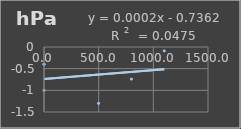
| Category | Presión Admosferica |
|---|---|
| 499.0 | -1.3 |
| 799.8 | -0.74 |
| 1099.8 | -0.09 |